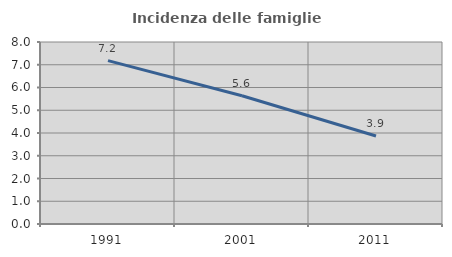
| Category | Incidenza delle famiglie numerose |
|---|---|
| 1991.0 | 7.18 |
| 2001.0 | 5.635 |
| 2011.0 | 3.868 |